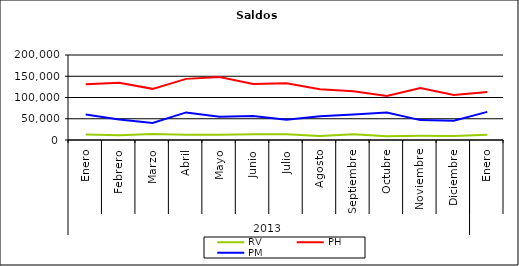
| Category | RV | PH | PM |
|---|---|---|---|
| 0 | 12966.437 | 131380.856 | 59975.653 |
| 1 | 11432.271 | 134655.891 | 48046.612 |
| 2 | 14149.543 | 120343.782 | 40297.909 |
| 3 | 12403.249 | 143830.507 | 64946.114 |
| 4 | 12323.134 | 148139.781 | 54592.514 |
| 5 | 13759.976 | 131634.752 | 56652.701 |
| 6 | 13256.014 | 133515.147 | 47907.561 |
| 7 | 9335.8 | 119600.732 | 55860.576 |
| 8 | 13362.811 | 114843.232 | 59771.51 |
| 9 | 9080.978 | 103607.627 | 64696.186 |
| 10 | 9993.913 | 122533.872 | 46801.148 |
| 11 | 9303.464 | 105747.395 | 45455.331 |
| 12 | 12145.055 | 112918.262 | 66200.17 |